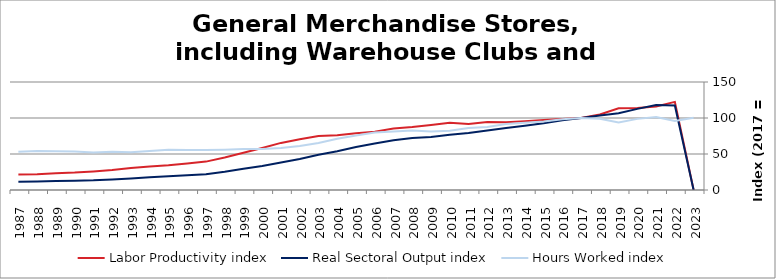
| Category | Labor Productivity index | Real Sectoral Output index | Hours Worked index |
|---|---|---|---|
| 2023.0 | 0 | 0 | 100.493 |
| 2022.0 | 122.37 | 117.273 | 95.835 |
| 2021.0 | 116.128 | 117.89 | 101.518 |
| 2020.0 | 114.033 | 112.662 | 98.797 |
| 2019.0 | 113.476 | 106.584 | 93.927 |
| 2018.0 | 104.798 | 103.589 | 98.847 |
| 2017.0 | 100 | 100 | 100 |
| 2016.0 | 98.546 | 96.744 | 98.172 |
| 2015.0 | 97.243 | 92.567 | 95.192 |
| 2014.0 | 95.39 | 89.164 | 93.474 |
| 2013.0 | 94.027 | 86.083 | 91.552 |
| 2012.0 | 94.346 | 82.497 | 87.441 |
| 2011.0 | 91.823 | 79.197 | 86.25 |
| 2010.0 | 93.368 | 76.884 | 82.345 |
| 2009.0 | 90.416 | 73.542 | 81.338 |
| 2008.0 | 87.456 | 72.298 | 82.668 |
| 2007.0 | 85.393 | 69.237 | 81.081 |
| 2006.0 | 81.021 | 64.581 | 79.709 |
| 2005.0 | 78.921 | 59.64 | 75.569 |
| 2004.0 | 75.952 | 53.952 | 71.035 |
| 2003.0 | 74.904 | 48.93 | 65.324 |
| 2002.0 | 70.506 | 43.002 | 60.991 |
| 2001.0 | 65.415 | 38.073 | 58.202 |
| 2000.0 | 58.299 | 33.272 | 57.071 |
| 1999.0 | 51.74 | 29.401 | 56.825 |
| 1998.0 | 45.222 | 25.34 | 56.035 |
| 1997.0 | 39.431 | 21.952 | 55.671 |
| 1996.0 | 36.95 | 20.566 | 55.66 |
| 1995.0 | 34.31 | 19.163 | 55.852 |
| 1994.0 | 32.639 | 17.643 | 54.055 |
| 1993.0 | 30.698 | 16.133 | 52.552 |
| 1992.0 | 27.614 | 14.669 | 53.12 |
| 1991.0 | 25.689 | 13.411 | 52.203 |
| 1990.0 | 24.168 | 12.912 | 53.426 |
| 1989.0 | 23.296 | 12.556 | 53.897 |
| 1988.0 | 22.046 | 11.927 | 54.102 |
| 1987.0 | 21.636 | 11.482 | 53.07 |